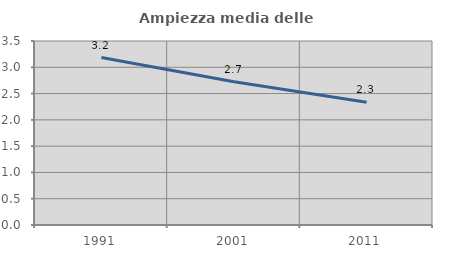
| Category | Ampiezza media delle famiglie |
|---|---|
| 1991.0 | 3.185 |
| 2001.0 | 2.723 |
| 2011.0 | 2.334 |